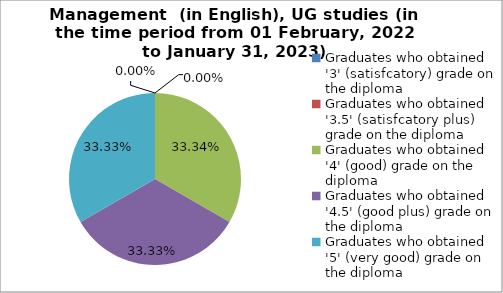
| Category | Series 0 |
|---|---|
| Graduates who obtained '3' (satisfcatory) grade on the diploma  | 0 |
| Graduates who obtained '3.5' (satisfcatory plus) grade on the diploma  | 0 |
| Graduates who obtained '4' (good) grade on the diploma  | 33.333 |
| Graduates who obtained '4.5' (good plus) grade on the diploma  | 33.333 |
| Graduates who obtained '5' (very good) grade on the diploma  | 33.333 |